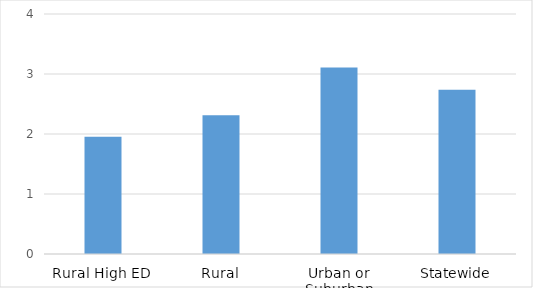
| Category | 1.952380952 2.3125 3.108108108 2.739130435 |
|---|---|
| Rural High ED | 1.952 |
| Rural | 2.312 |
| Urban or Suburban | 3.108 |
| Statewide | 2.739 |